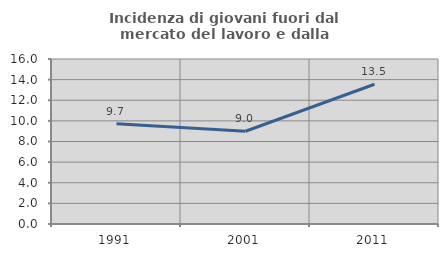
| Category | Incidenza di giovani fuori dal mercato del lavoro e dalla formazione  |
|---|---|
| 1991.0 | 9.726 |
| 2001.0 | 8.993 |
| 2011.0 | 13.548 |